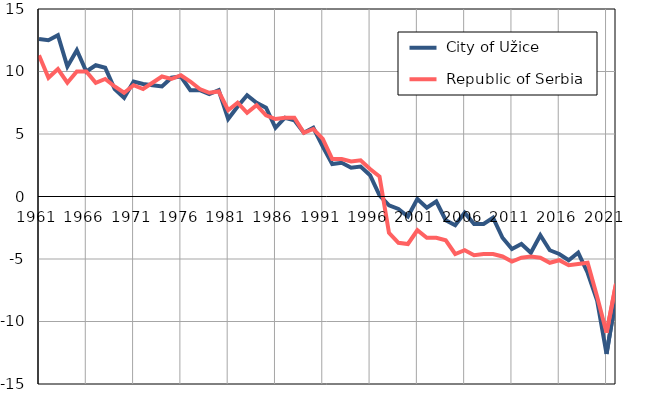
| Category |  City of Užice |  Republic of Serbia |
|---|---|---|
| 1961.0 | 12.6 | 11.3 |
| 1962.0 | 12.5 | 9.5 |
| 1963.0 | 12.9 | 10.2 |
| 1964.0 | 10.4 | 9.1 |
| 1965.0 | 11.7 | 10 |
| 1966.0 | 10 | 10 |
| 1967.0 | 10.5 | 9.1 |
| 1968.0 | 10.3 | 9.4 |
| 1969.0 | 8.6 | 8.8 |
| 1970.0 | 7.9 | 8.3 |
| 1971.0 | 9.2 | 8.9 |
| 1972.0 | 9 | 8.6 |
| 1973.0 | 8.9 | 9.1 |
| 1974.0 | 8.8 | 9.6 |
| 1975.0 | 9.5 | 9.4 |
| 1976.0 | 9.6 | 9.7 |
| 1977.0 | 8.5 | 9.2 |
| 1978.0 | 8.5 | 8.6 |
| 1979.0 | 8.2 | 8.3 |
| 1980.0 | 8.5 | 8.4 |
| 1981.0 | 6.2 | 6.9 |
| 1982.0 | 7.2 | 7.5 |
| 1983.0 | 8.1 | 6.7 |
| 1984.0 | 7.5 | 7.3 |
| 1985.0 | 7.1 | 6.5 |
| 1986.0 | 5.5 | 6.2 |
| 1987.0 | 6.3 | 6.3 |
| 1988.0 | 6.1 | 6.3 |
| 1989.0 | 5.1 | 5.1 |
| 1990.0 | 5.5 | 5.4 |
| 1991.0 | 4 | 4.6 |
| 1992.0 | 2.6 | 3 |
| 1993.0 | 2.7 | 3 |
| 1994.0 | 2.3 | 2.8 |
| 1995.0 | 2.4 | 2.9 |
| 1996.0 | 1.7 | 2.2 |
| 1997.0 | 0.1 | 1.6 |
| 1998.0 | -0.7 | -2.9 |
| 1999.0 | -1 | -3.7 |
| 2000.0 | -1.6 | -3.8 |
| 2001.0 | -0.2 | -2.7 |
| 2002.0 | -0.9 | -3.3 |
| 2003.0 | -0.4 | -3.3 |
| 2004.0 | -1.9 | -3.5 |
| 2005.0 | -2.3 | -4.6 |
| 2006.0 | -1.3 | -4.3 |
| 2007.0 | -2.2 | -4.7 |
| 2008.0 | -2.2 | -4.6 |
| 2009.0 | -1.7 | -4.6 |
| 2010.0 | -3.3 | -4.8 |
| 2011.0 | -4.2 | -5.2 |
| 2012.0 | -3.8 | -4.9 |
| 2013.0 | -4.5 | -4.8 |
| 2014.0 | -3.1 | -4.9 |
| 2015.0 | -4.3 | -5.3 |
| 2016.0 | -4.6 | -5.1 |
| 2017.0 | -5.1 | -5.5 |
| 2018.0 | -4.5 | -5.4 |
| 2019.0 | -6.1 | -5.3 |
| 2020.0 | -8.3 | -8 |
| 2021.0 | -12.6 | -10.9 |
| 2022.0 | -8 | -7 |